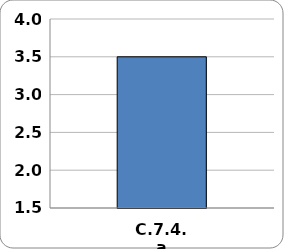
| Category | Series 0 |
|---|---|
| C.7.4.a | 3.5 |